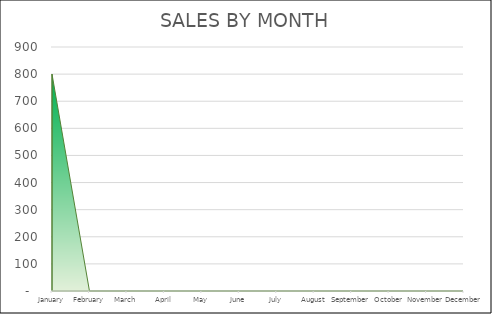
| Category | AMOUNT |
|---|---|
| January | 800 |
| February | 0 |
| March | 0 |
| April | 0 |
| May | 0 |
| June | 0 |
| July | 0 |
| August | 0 |
| September | 0 |
| October | 0 |
| November | 0 |
| December | 0 |